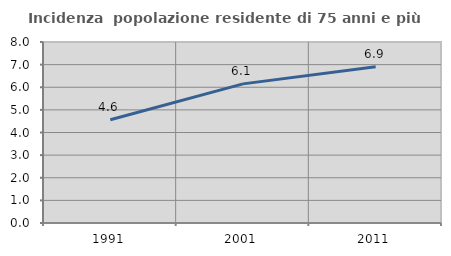
| Category | Incidenza  popolazione residente di 75 anni e più |
|---|---|
| 1991.0 | 4.561 |
| 2001.0 | 6.149 |
| 2011.0 | 6.907 |